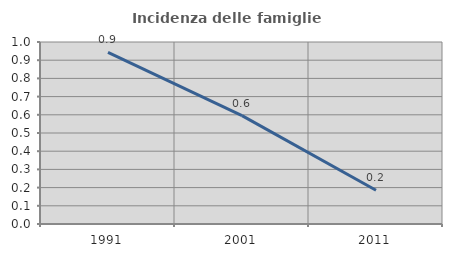
| Category | Incidenza delle famiglie numerose |
|---|---|
| 1991.0 | 0.943 |
| 2001.0 | 0.595 |
| 2011.0 | 0.186 |